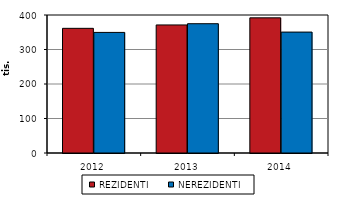
| Category | REZIDENTI | NEREZIDENTI |
|---|---|---|
| 2012.0 | 361327 | 349531 |
| 2013.0 | 371191 | 374744 |
| 2014.0 | 391793 | 350488 |